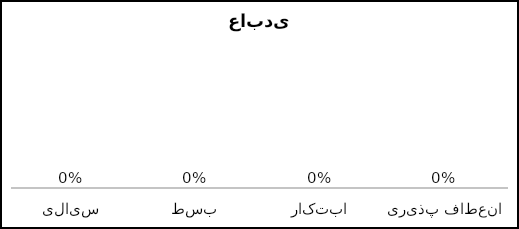
| Category | Series 0 |
|---|---|
| سیالی | 0 |
| بسط | 0 |
| ابتکار | 0 |
| انعطاف پذیری | 0 |